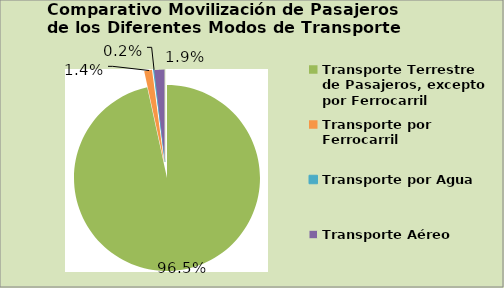
| Category | Series 0 |
|---|---|
| Transporte Terrestre de Pasajeros, excepto por Ferrocarril | 96.453 |
| Transporte por Ferrocarril | 1.357 |
| Transporte por Agua | 0.2 |
| Transporte Aéreo | 1.853 |